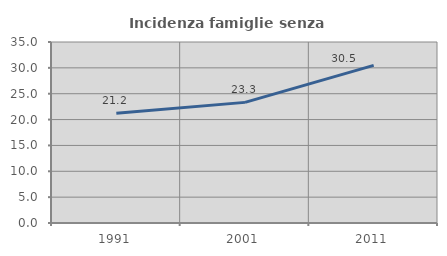
| Category | Incidenza famiglie senza nuclei |
|---|---|
| 1991.0 | 21.241 |
| 2001.0 | 23.326 |
| 2011.0 | 30.488 |